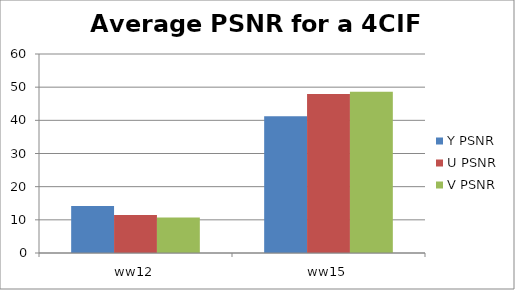
| Category | Y PSNR | U PSNR | V PSNR |
|---|---|---|---|
| ww12 | 14.15 | 11.42 | 10.68 |
| ww15 | 41.23 | 47.92 | 48.62 |